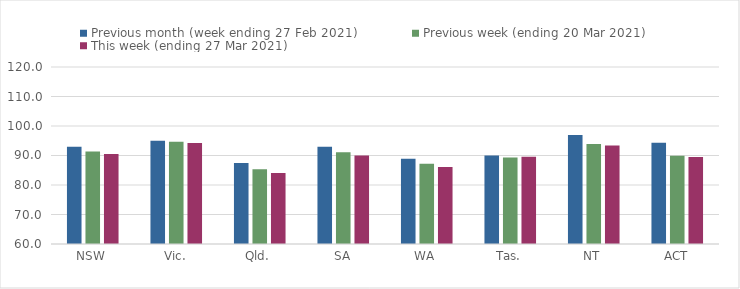
| Category | Previous month (week ending 27 Feb 2021) | Previous week (ending 20 Mar 2021) | This week (ending 27 Mar 2021) |
|---|---|---|---|
| NSW | 93 | 91.33 | 90.55 |
| Vic. | 95.04 | 94.64 | 94.2 |
| Qld. | 87.45 | 85.37 | 84.04 |
| SA | 93 | 91.08 | 89.96 |
| WA | 88.94 | 87.2 | 86.11 |
| Tas. | 90.03 | 89.34 | 89.55 |
| NT | 96.93 | 93.86 | 93.42 |
| ACT | 94.28 | 89.91 | 89.45 |